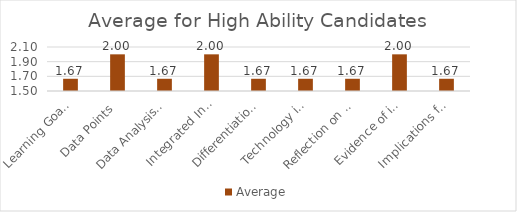
| Category | Average |
|---|---|
| Learning Goals Aligned with Pre-/Post-assessments ACEI 4.0 | 1.667 |
| Data Points | 2 |
| Data Analysis for Pedagogical Decisions ACEI 4.0 | 1.667 |
| Integrated Instruction ACEI 3.1 | 2 |
| Differentiation based on knowledge of individual learning ACEI 3.2 | 1.667 |
| Technology integration | 1.667 |
| Reflection on pedagogical decisions ACEI 1.0 | 1.667 |
| Evidence of impact on student learning ACEI 5.1 | 2 |
| Implications for teaching and professional development ACEI 5.1 | 1.667 |